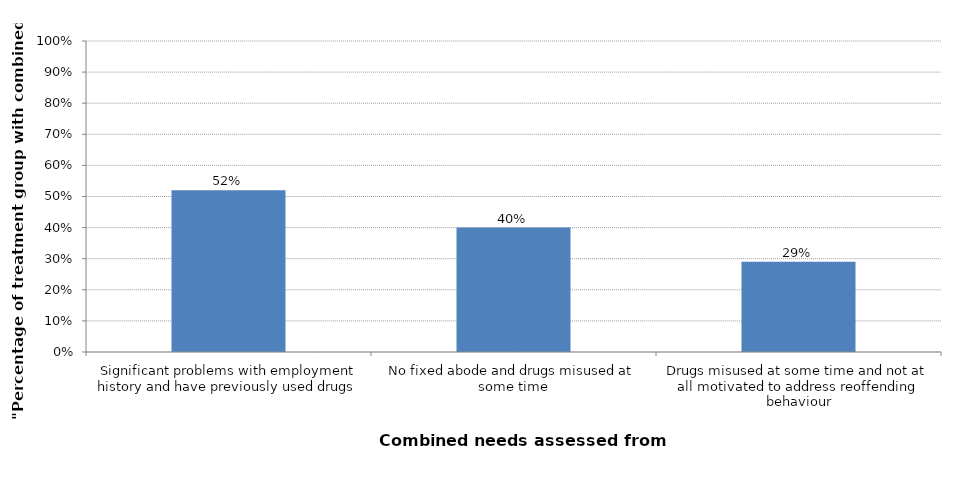
| Category | Series 0 |
|---|---|
| Significant problems with employment history and have previously used drugs | 0.52 |
| No fixed abode and drugs misused at some time | 0.4 |
| Drugs misused at some time and not at all motivated to address reoffending behaviour | 0.29 |